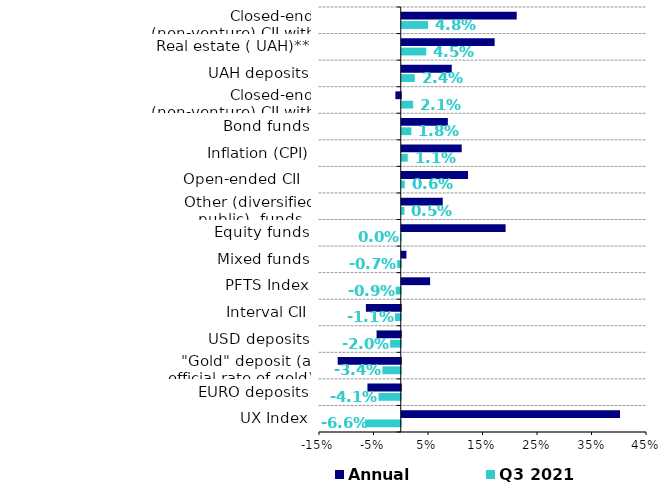
| Category | Q3 2021 | Annual |
|---|---|---|
| UX Index | -0.066 | 0.4 |
| EURO deposits | -0.041 | -0.061 |
| "Gold" deposit (at official rate of gold) | -0.034 | -0.116 |
| USD deposits | -0.02 | -0.044 |
| Interval CII | -0.011 | -0.064 |
| PFTS Index | -0.009 | 0.052 |
| Mixed funds | -0.007 | 0.009 |
| Equity funds | 0 | 0.191 |
| Other (diversified public)  funds    | 0.005 | 0.075 |
| Open-ended CII   | 0.006 | 0.122 |
| Inflation (CPI) | 0.011 | 0.11 |
| Bond funds | 0.018 | 0.085 |
| Closed-end (non-venture) CII with private issue | 0.021 | -0.01 |
| UAH deposits | 0.024 | 0.092 |
| Real estate ( UAH)** | 0.045 | 0.17 |
| Closed-end (non-venture) CII with public issue | 0.048 | 0.211 |